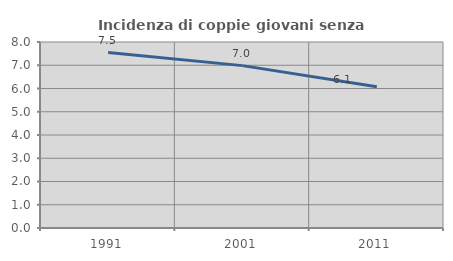
| Category | Incidenza di coppie giovani senza figli |
|---|---|
| 1991.0 | 7.548 |
| 2001.0 | 6.984 |
| 2011.0 | 6.075 |